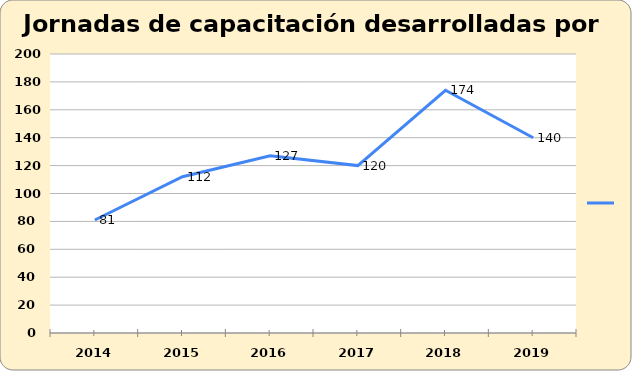
| Category | Series 0 |
|---|---|
| 2014.0 | 81 |
| 2015.0 | 112 |
| 2016.0 | 127 |
| 2017.0 | 120 |
| 2018.0 | 174 |
| 2019.0 | 140 |